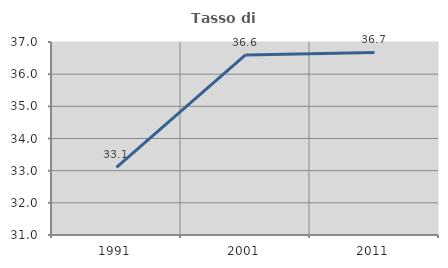
| Category | Tasso di occupazione   |
|---|---|
| 1991.0 | 33.105 |
| 2001.0 | 36.599 |
| 2011.0 | 36.676 |